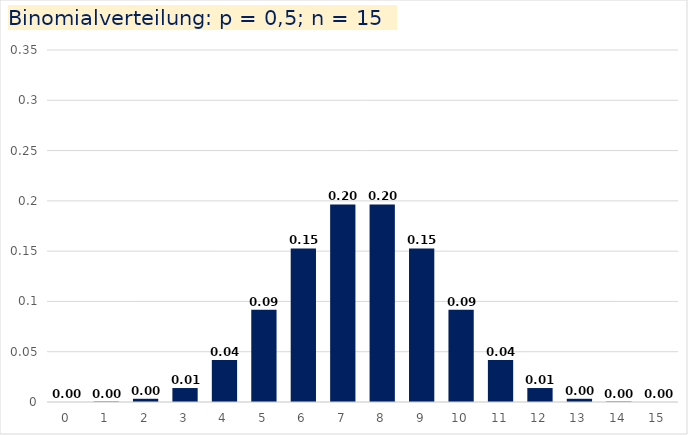
| Category | Binomialverteilung |
|---|---|
| 0.0 | 0 |
| 1.0 | 0 |
| 2.0 | 0.003 |
| 3.0 | 0.014 |
| 4.0 | 0.042 |
| 5.0 | 0.092 |
| 6.0 | 0.153 |
| 7.0 | 0.196 |
| 8.0 | 0.196 |
| 9.0 | 0.153 |
| 10.0 | 0.092 |
| 11.0 | 0.042 |
| 12.0 | 0.014 |
| 13.0 | 0.003 |
| 14.0 | 0 |
| 15.0 | 0 |